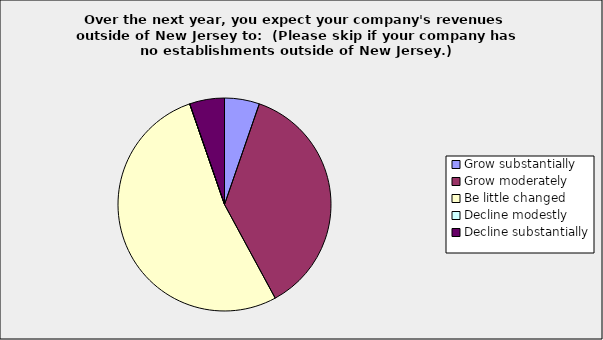
| Category | Series 0 |
|---|---|
| Grow substantially | 0.053 |
| Grow moderately | 0.368 |
| Be little changed | 0.526 |
| Decline modestly | 0 |
| Decline substantially | 0.053 |